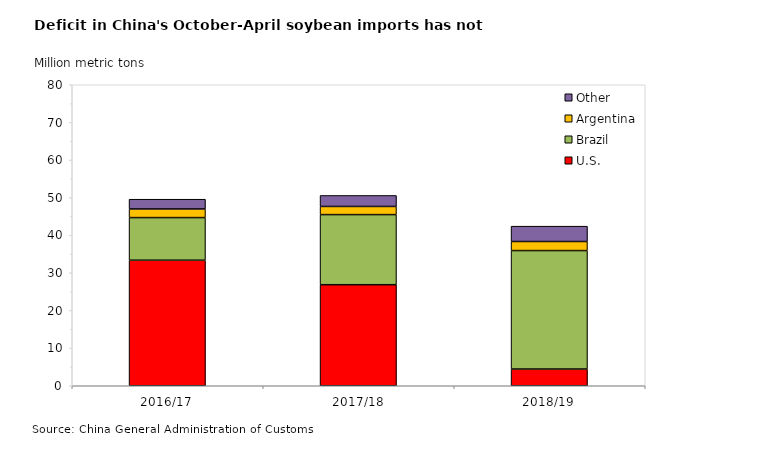
| Category | U.S. | Brazil | Argentina | Other |
|---|---|---|---|---|
| 2016/17 | 33.364 | 11.332 | 2.294 | 2.59 |
| 2017/18 | 26.856 | 18.633 | 2.167 | 2.918 |
| 2018/19 | 4.446 | 31.484 | 2.406 | 4.08 |